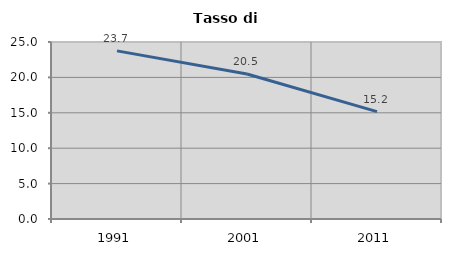
| Category | Tasso di disoccupazione   |
|---|---|
| 1991.0 | 23.749 |
| 2001.0 | 20.484 |
| 2011.0 | 15.164 |